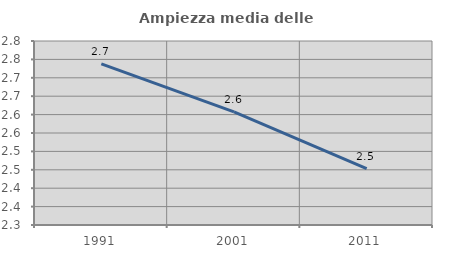
| Category | Ampiezza media delle famiglie |
|---|---|
| 1991.0 | 2.738 |
| 2001.0 | 2.607 |
| 2011.0 | 2.453 |